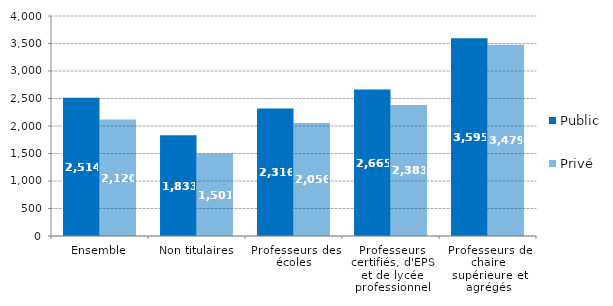
| Category | Public | Privé |
|---|---|---|
| Ensemble | 2514 | 2120 |
| Non titulaires | 1833 | 1501 |
| Professeurs des écoles | 2316 | 2056 |
| Professeurs certifiés, d'EPS et de lycée professionnel | 2665 | 2383 |
| Professeurs de chaire supérieure et agrégés | 3595 | 3479 |